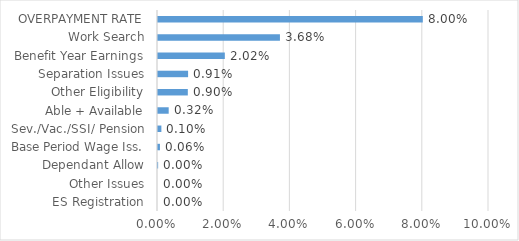
| Category | Series 0 |
|---|---|
| ES Registration | 0 |
| Other Issues | 0 |
| Dependant Allow | 0 |
| Base Period Wage Iss. | 0.001 |
| Sev./Vac./SSI/ Pension | 0.001 |
| Able + Available | 0.003 |
| Other Eligibility | 0.009 |
| Separation Issues | 0.009 |
| Benefit Year Earnings | 0.02 |
| Work Search | 0.037 |
| OVERPAYMENT RATE | 0.08 |